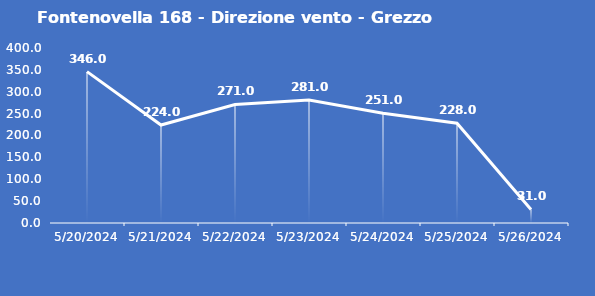
| Category | Fontenovella 168 - Direzione vento - Grezzo (°N) |
|---|---|
| 5/20/24 | 346 |
| 5/21/24 | 224 |
| 5/22/24 | 271 |
| 5/23/24 | 281 |
| 5/24/24 | 251 |
| 5/25/24 | 228 |
| 5/26/24 | 31 |